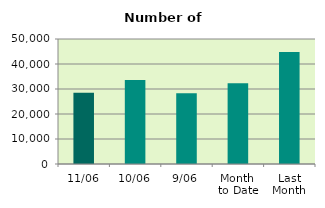
| Category | Series 0 |
|---|---|
| 11/06 | 28536 |
| 10/06 | 33592 |
| 9/06 | 28274 |
| Month 
to Date | 32261.556 |
| Last
Month | 44751.81 |